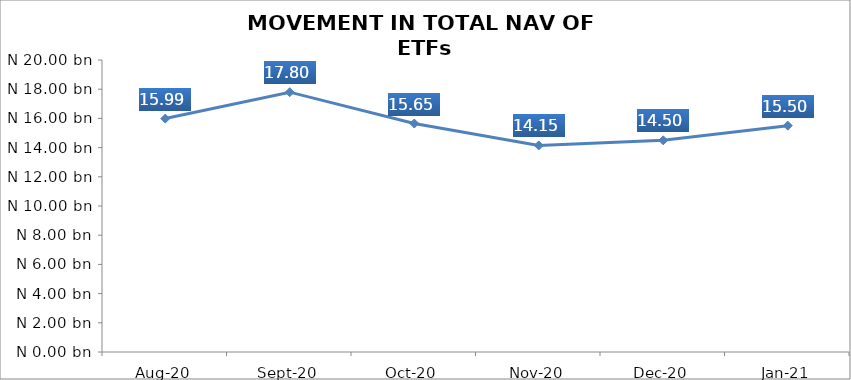
| Category | Series 0 |
|---|---|
| 2020-08-01 | 15987397591.7 |
| 2020-09-01 | 17796594275.01 |
| 2020-10-01 | 15650550930.52 |
| 2020-11-01 | 14147234611.75 |
| 2020-12-01 | 14497616847 |
| 2021-01-01 | 15503709271.98 |